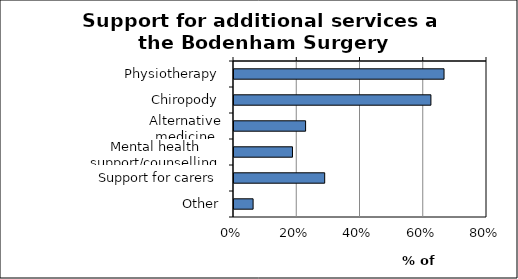
| Category | Series 0 |
|---|---|
| Physiotherapy | 0.664 |
| Chiropody | 0.623 |
| Alternative medicine | 0.226 |
| Mental health support/counselling | 0.185 |
| Support for carers | 0.287 |
| Other | 0.06 |